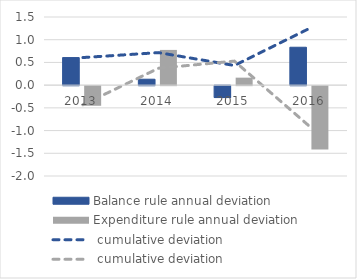
| Category | Balance rule | Expenditure rule |
|---|---|---|
| 2013.0 | 0.607 | -0.432 |
| 2014.0 | 0.131 | 0.775 |
| 2015.0 | -0.262 | 0.165 |
| 2016.0 | 0.834 | -1.393 |